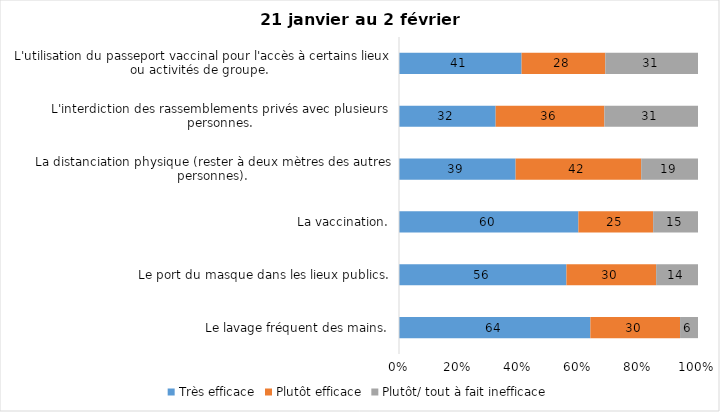
| Category | Très efficace | Plutôt efficace | Plutôt/ tout à fait inefficace |
|---|---|---|---|
| Le lavage fréquent des mains. | 64 | 30 | 6 |
| Le port du masque dans les lieux publics. | 56 | 30 | 14 |
| La vaccination. | 60 | 25 | 15 |
| La distanciation physique (rester à deux mètres des autres personnes). | 39 | 42 | 19 |
| L'interdiction des rassemblements privés avec plusieurs personnes. | 32 | 36 | 31 |
| L'utilisation du passeport vaccinal pour l'accès à certains lieux ou activités de groupe.  | 41 | 28 | 31 |